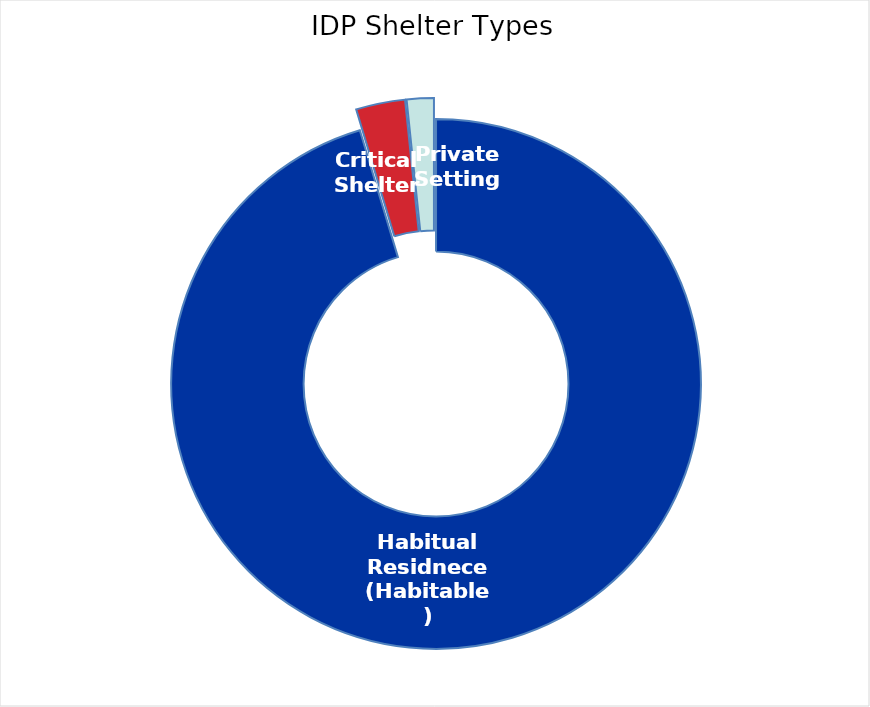
| Category | Families |
|---|---|
| Habitual Residnece (Habitable) | 684190 |
| Critical Shelter | 21498 |
| Private Setting | 11835 |